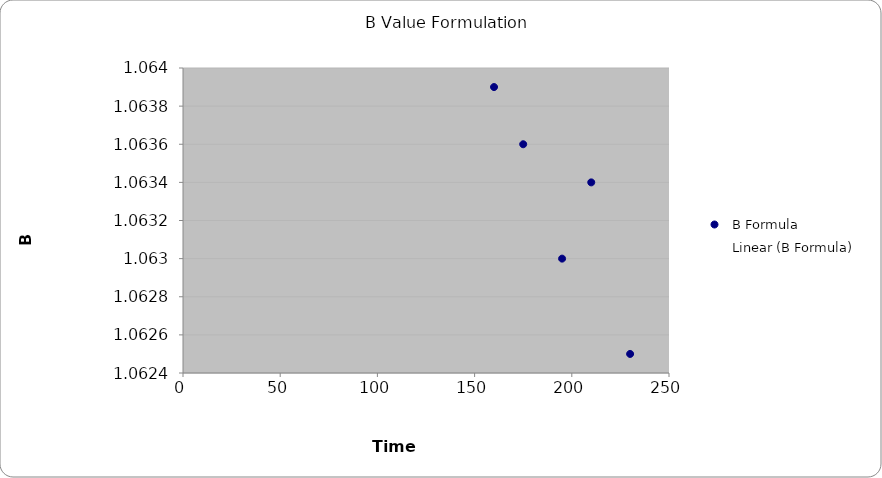
| Category | B Formula |
|---|---|
| 160.0 | 1.064 |
| 175.0 | 1.064 |
| 195.0 | 1.063 |
| 210.0 | 1.063 |
| 230.0 | 1.062 |